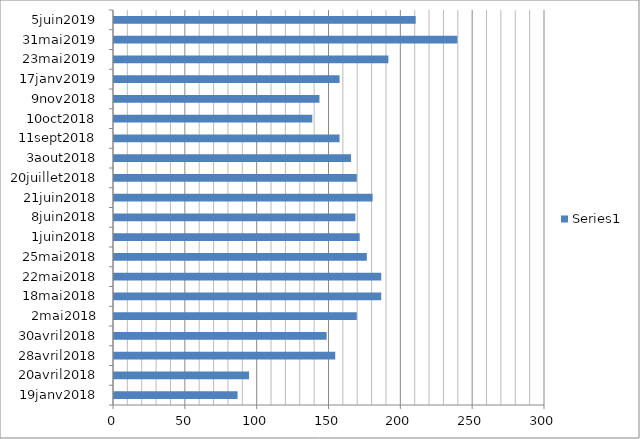
| Category | Series 0 |
|---|---|
| 19janv2018 | 86 |
| 20avril2018 | 94 |
| 28avril2018 | 154 |
| 30avril2018 | 148 |
| 2mai2018 | 169 |
| 18mai2018 | 186 |
| 22mai2018 | 186 |
| 25mai2018 | 176 |
| 1juin2018 | 171 |
| 8juin2018 | 168 |
| 21juin2018 | 180 |
| 20juillet2018 | 169 |
| 3aout2018 | 165 |
| 11sept2018 | 157 |
| 10oct2018 | 138 |
| 9nov2018 | 143 |
| 17janv2019 | 157 |
| 23mai2019 | 191 |
| 31mai2019 | 239 |
| 5juin2019 | 210 |